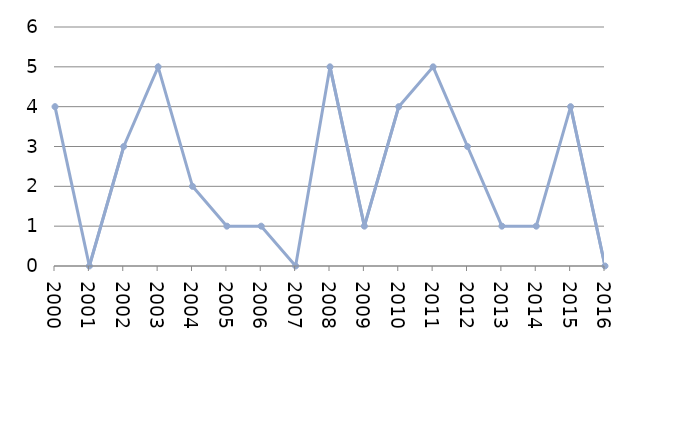
| Category | Avlidna |
|---|---|
| 2000 | 4 |
| 2001 | 0 |
| 2002 | 3 |
| 2003 | 5 |
| 2004 | 2 |
| 2005 | 1 |
| 2006 | 1 |
| 2007 | 0 |
| 2008 | 5 |
| 2009 | 1 |
| 2010 | 4 |
| 2011 | 5 |
| 2012 | 3 |
| 2013 | 1 |
| 2014 | 1 |
| 2015 | 4 |
| 2016 | 0 |